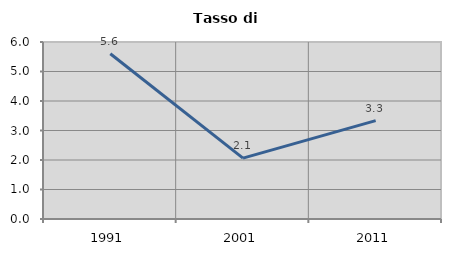
| Category | Tasso di disoccupazione   |
|---|---|
| 1991.0 | 5.6 |
| 2001.0 | 2.062 |
| 2011.0 | 3.333 |